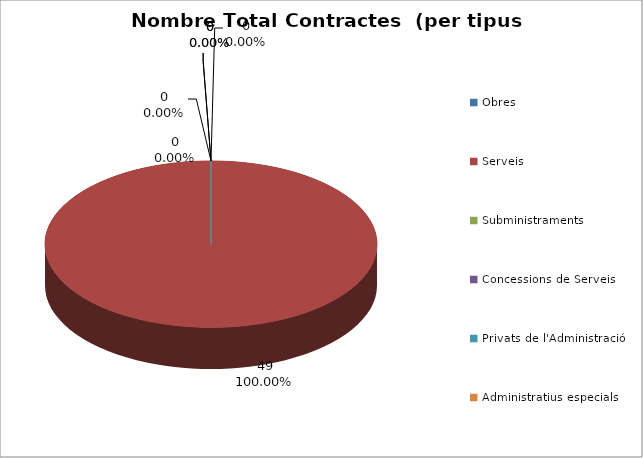
| Category | Nombre Total Contractes |
|---|---|
| Obres | 0 |
| Serveis | 49 |
| Subministraments | 0 |
| Concessions de Serveis | 0 |
| Privats de l'Administració | 0 |
| Administratius especials | 0 |